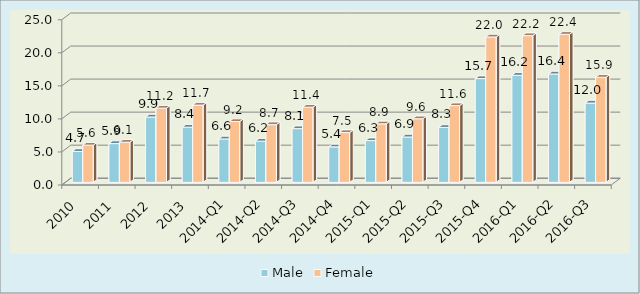
| Category | Male | Female |
|---|---|---|
| 2010 | 4.68 | 5.629 |
| 2011 | 5.866 | 6.075 |
| 2012 | 9.889 | 11.231 |
| 2013 | 8.354 | 11.688 |
| 2014-Q1 | 6.572 | 9.201 |
| 2014-Q2 | 6.237 | 8.732 |
| 2014-Q3 | 8.129 | 11.374 |
| 2014-Q4 | 5.369 | 7.53 |
| 2015-Q1 | 6.317 | 8.854 |
| 2015-Q2 | 6.869 | 9.625 |
| 2015-Q3 | 8.315 | 11.61 |
| 2015-Q4 | 15.7 | 22 |
| 2016-Q1 | 16.2 | 22.2 |
| 2016-Q2 | 16.4 | 22.4 |
| 2016-Q3 | 12 | 15.9 |